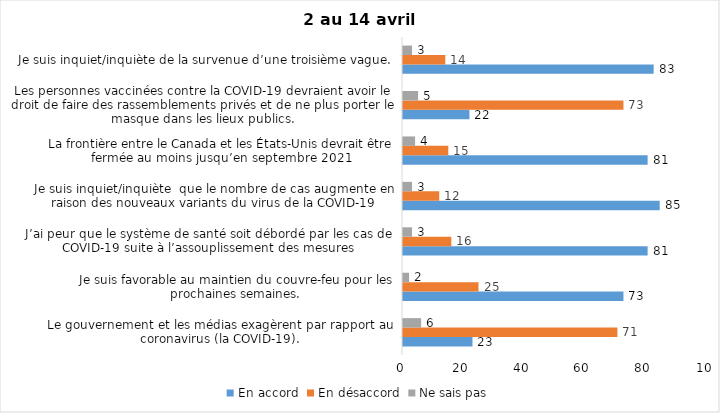
| Category | En accord | En désaccord | Ne sais pas |
|---|---|---|---|
| Le gouvernement et les médias exagèrent par rapport au coronavirus (la COVID-19). | 23 | 71 | 6 |
| Je suis favorable au maintien du couvre-feu pour les prochaines semaines. | 73 | 25 | 2 |
| J’ai peur que le système de santé soit débordé par les cas de COVID-19 suite à l’assouplissement des mesures | 81 | 16 | 3 |
| Je suis inquiet/inquiète  que le nombre de cas augmente en raison des nouveaux variants du virus de la COVID-19 | 85 | 12 | 3 |
| La frontière entre le Canada et les États-Unis devrait être fermée au moins jusqu’en septembre 2021 | 81 | 15 | 4 |
| Les personnes vaccinées contre la COVID-19 devraient avoir le droit de faire des rassemblements privés et de ne plus porter le masque dans les lieux publics. | 22 | 73 | 5 |
| Je suis inquiet/inquiète de la survenue d’une troisième vague. | 83 | 14 | 3 |